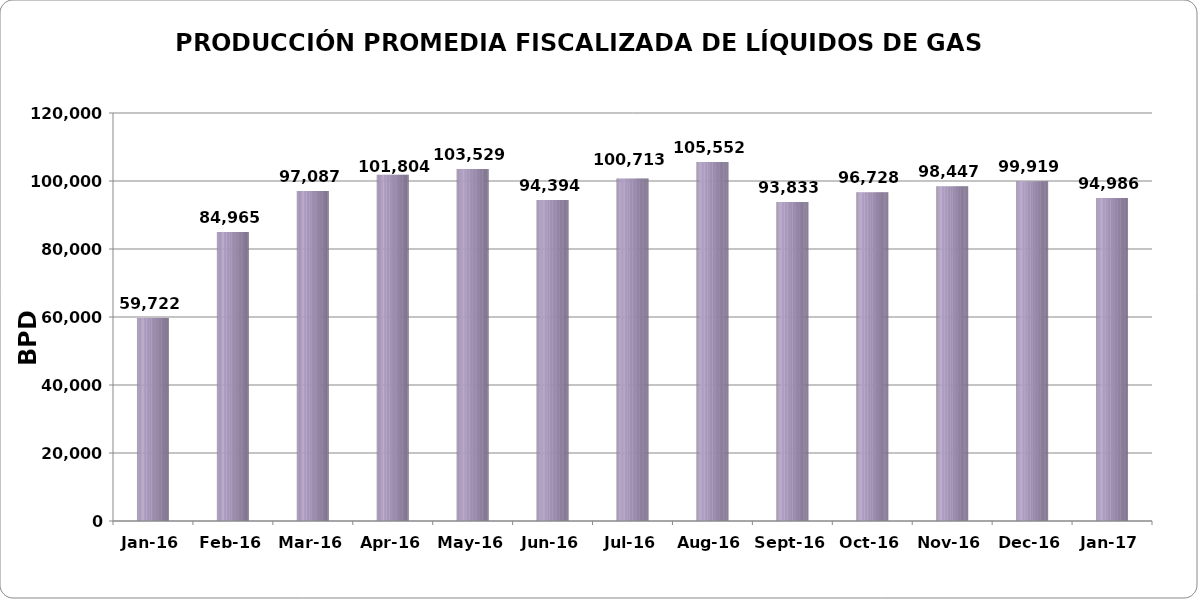
| Category | Series 0 |
|---|---|
| 2016-01-01 | 59721.968 |
| 2016-02-01 | 84964.724 |
| 2016-03-01 | 97087.097 |
| 2016-04-01 | 101803.833 |
| 2016-05-01 | 103529.194 |
| 2016-06-01 | 94393.767 |
| 2016-07-01 | 100713.355 |
| 2016-08-01 | 105552.1 |
| 2016-09-01 | 93833.1 |
| 2016-10-01 | 96727.548 |
| 2016-11-01 | 98446.71 |
| 2016-12-01 | 99919.129 |
| 2017-01-01 | 94986 |